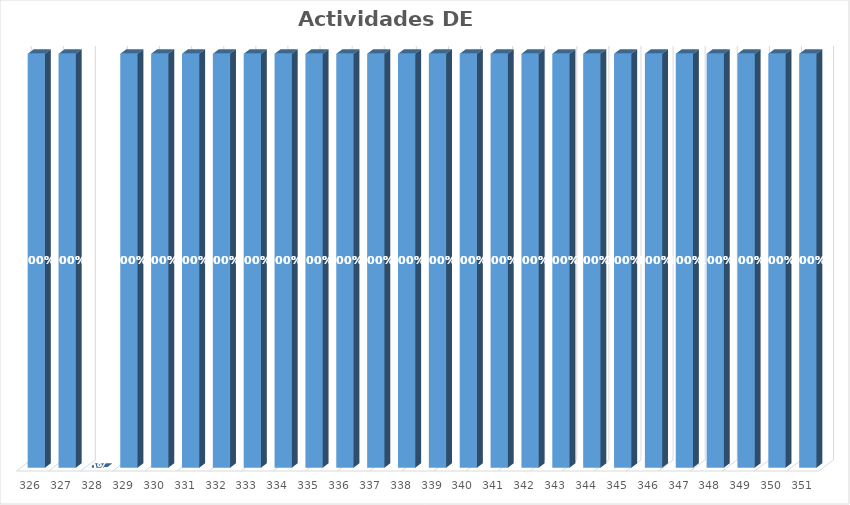
| Category | % Avance |
|---|---|
| 326.0 | 1 |
| 327.0 | 1 |
| 328.0 | 0 |
| 329.0 | 1 |
| 330.0 | 1 |
| 331.0 | 1 |
| 332.0 | 1 |
| 333.0 | 1 |
| 334.0 | 1 |
| 335.0 | 1 |
| 336.0 | 1 |
| 337.0 | 1 |
| 338.0 | 1 |
| 339.0 | 1 |
| 340.0 | 1 |
| 341.0 | 1 |
| 342.0 | 1 |
| 343.0 | 1 |
| 344.0 | 1 |
| 345.0 | 1 |
| 346.0 | 1 |
| 347.0 | 1 |
| 348.0 | 1 |
| 349.0 | 1 |
| 350.0 | 1 |
| 351.0 | 1 |